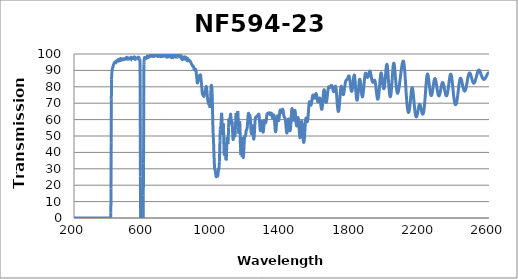
| Category | Transmission (%) |
|---|---|
| 2600.0 | 88.464 |
| 2599.0 | 88.485 |
| 2598.0 | 88.47 |
| 2597.0 | 88.44 |
| 2596.0 | 88.397 |
| 2595.0 | 88.304 |
| 2594.0 | 88.188 |
| 2593.0 | 88.125 |
| 2592.0 | 87.924 |
| 2591.0 | 87.725 |
| 2590.0 | 87.551 |
| 2589.0 | 87.424 |
| 2588.0 | 87.231 |
| 2587.0 | 87.037 |
| 2586.0 | 86.767 |
| 2585.0 | 86.582 |
| 2584.0 | 86.371 |
| 2583.0 | 86.162 |
| 2582.0 | 85.904 |
| 2581.0 | 85.711 |
| 2580.0 | 85.522 |
| 2579.0 | 85.347 |
| 2578.0 | 85.222 |
| 2577.0 | 85.022 |
| 2576.0 | 84.879 |
| 2575.0 | 84.786 |
| 2574.0 | 84.687 |
| 2573.0 | 84.596 |
| 2572.0 | 84.533 |
| 2571.0 | 84.469 |
| 2570.0 | 84.497 |
| 2569.0 | 84.521 |
| 2568.0 | 84.594 |
| 2567.0 | 84.698 |
| 2566.0 | 84.796 |
| 2565.0 | 84.958 |
| 2564.0 | 85.135 |
| 2563.0 | 85.333 |
| 2562.0 | 85.531 |
| 2561.0 | 85.71 |
| 2560.0 | 85.964 |
| 2559.0 | 86.209 |
| 2558.0 | 86.467 |
| 2557.0 | 86.714 |
| 2556.0 | 86.943 |
| 2555.0 | 87.203 |
| 2554.0 | 87.513 |
| 2553.0 | 87.805 |
| 2552.0 | 88.109 |
| 2551.0 | 88.415 |
| 2550.0 | 88.728 |
| 2549.0 | 89.023 |
| 2548.0 | 89.324 |
| 2547.0 | 89.566 |
| 2546.0 | 89.78 |
| 2545.0 | 89.955 |
| 2544.0 | 90.058 |
| 2543.0 | 90.173 |
| 2542.0 | 90.222 |
| 2541.0 | 90.188 |
| 2540.0 | 90.121 |
| 2539.0 | 90.014 |
| 2538.0 | 89.876 |
| 2537.0 | 89.689 |
| 2536.0 | 89.462 |
| 2535.0 | 89.143 |
| 2534.0 | 88.819 |
| 2533.0 | 88.51 |
| 2532.0 | 88.196 |
| 2531.0 | 87.824 |
| 2530.0 | 87.352 |
| 2529.0 | 86.969 |
| 2528.0 | 86.607 |
| 2527.0 | 86.205 |
| 2526.0 | 85.827 |
| 2525.0 | 85.366 |
| 2524.0 | 84.939 |
| 2523.0 | 84.605 |
| 2522.0 | 84.263 |
| 2521.0 | 83.888 |
| 2520.0 | 83.534 |
| 2519.0 | 83.224 |
| 2518.0 | 82.944 |
| 2517.0 | 82.735 |
| 2516.0 | 82.552 |
| 2515.0 | 82.402 |
| 2514.0 | 82.27 |
| 2513.0 | 82.218 |
| 2512.0 | 82.195 |
| 2511.0 | 82.241 |
| 2510.0 | 82.333 |
| 2509.0 | 82.436 |
| 2508.0 | 82.61 |
| 2507.0 | 82.794 |
| 2506.0 | 83.057 |
| 2505.0 | 83.388 |
| 2504.0 | 83.718 |
| 2503.0 | 84.05 |
| 2502.0 | 84.407 |
| 2501.0 | 84.802 |
| 2500.0 | 85.188 |
| 2499.0 | 85.576 |
| 2498.0 | 85.958 |
| 2497.0 | 86.379 |
| 2496.0 | 86.757 |
| 2495.0 | 87.116 |
| 2494.0 | 87.455 |
| 2493.0 | 87.752 |
| 2492.0 | 87.957 |
| 2491.0 | 88.143 |
| 2490.0 | 88.297 |
| 2489.0 | 88.428 |
| 2488.0 | 88.496 |
| 2487.0 | 88.471 |
| 2486.0 | 88.348 |
| 2485.0 | 88.205 |
| 2484.0 | 88.03 |
| 2483.0 | 87.769 |
| 2482.0 | 87.436 |
| 2481.0 | 87.046 |
| 2480.0 | 86.631 |
| 2479.0 | 86.167 |
| 2478.0 | 85.638 |
| 2477.0 | 85.081 |
| 2476.0 | 84.497 |
| 2475.0 | 83.854 |
| 2474.0 | 83.224 |
| 2473.0 | 82.598 |
| 2472.0 | 81.976 |
| 2471.0 | 81.372 |
| 2470.0 | 80.773 |
| 2469.0 | 80.189 |
| 2468.0 | 79.682 |
| 2467.0 | 79.242 |
| 2466.0 | 78.821 |
| 2465.0 | 78.436 |
| 2464.0 | 78.088 |
| 2463.0 | 77.814 |
| 2462.0 | 77.618 |
| 2461.0 | 77.469 |
| 2460.0 | 77.356 |
| 2459.0 | 77.342 |
| 2458.0 | 77.398 |
| 2457.0 | 77.495 |
| 2456.0 | 77.644 |
| 2455.0 | 77.859 |
| 2454.0 | 78.117 |
| 2453.0 | 78.423 |
| 2452.0 | 78.778 |
| 2451.0 | 79.208 |
| 2450.0 | 79.658 |
| 2449.0 | 80.148 |
| 2448.0 | 80.663 |
| 2447.0 | 81.181 |
| 2446.0 | 81.68 |
| 2445.0 | 82.205 |
| 2444.0 | 82.725 |
| 2443.0 | 83.223 |
| 2442.0 | 83.706 |
| 2441.0 | 84.118 |
| 2440.0 | 84.47 |
| 2439.0 | 84.77 |
| 2438.0 | 85.023 |
| 2437.0 | 85.181 |
| 2436.0 | 85.235 |
| 2435.0 | 85.198 |
| 2434.0 | 85.086 |
| 2433.0 | 84.897 |
| 2432.0 | 84.589 |
| 2431.0 | 84.168 |
| 2430.0 | 83.64 |
| 2429.0 | 83.044 |
| 2428.0 | 82.402 |
| 2427.0 | 81.683 |
| 2426.0 | 80.899 |
| 2425.0 | 80.036 |
| 2424.0 | 79.166 |
| 2423.0 | 78.289 |
| 2422.0 | 77.414 |
| 2421.0 | 76.537 |
| 2420.0 | 75.643 |
| 2419.0 | 74.762 |
| 2418.0 | 73.923 |
| 2417.0 | 73.13 |
| 2416.0 | 72.426 |
| 2415.0 | 71.773 |
| 2414.0 | 71.183 |
| 2413.0 | 70.653 |
| 2412.0 | 70.184 |
| 2411.0 | 69.8 |
| 2410.0 | 69.505 |
| 2409.0 | 69.296 |
| 2408.0 | 69.161 |
| 2407.0 | 69.105 |
| 2406.0 | 69.133 |
| 2405.0 | 69.242 |
| 2404.0 | 69.441 |
| 2403.0 | 69.718 |
| 2402.0 | 70.106 |
| 2401.0 | 70.578 |
| 2400.0 | 71.14 |
| 2399.0 | 71.807 |
| 2398.0 | 72.537 |
| 2397.0 | 73.348 |
| 2396.0 | 74.207 |
| 2395.0 | 75.11 |
| 2394.0 | 76.12 |
| 2393.0 | 77.199 |
| 2392.0 | 78.244 |
| 2391.0 | 79.277 |
| 2390.0 | 80.32 |
| 2389.0 | 81.364 |
| 2388.0 | 82.415 |
| 2387.0 | 83.409 |
| 2386.0 | 84.32 |
| 2385.0 | 85.158 |
| 2384.0 | 85.929 |
| 2383.0 | 86.563 |
| 2382.0 | 87.062 |
| 2381.0 | 87.432 |
| 2380.0 | 87.644 |
| 2379.0 | 87.724 |
| 2378.0 | 87.695 |
| 2377.0 | 87.541 |
| 2376.0 | 87.282 |
| 2375.0 | 86.941 |
| 2374.0 | 86.428 |
| 2373.0 | 85.798 |
| 2372.0 | 85.106 |
| 2371.0 | 84.396 |
| 2370.0 | 83.642 |
| 2369.0 | 82.818 |
| 2368.0 | 81.99 |
| 2367.0 | 81.183 |
| 2366.0 | 80.345 |
| 2365.0 | 79.538 |
| 2364.0 | 78.75 |
| 2363.0 | 77.999 |
| 2362.0 | 77.304 |
| 2361.0 | 76.697 |
| 2360.0 | 76.131 |
| 2359.0 | 75.658 |
| 2358.0 | 75.26 |
| 2357.0 | 74.905 |
| 2356.0 | 74.655 |
| 2355.0 | 74.513 |
| 2354.0 | 74.465 |
| 2353.0 | 74.511 |
| 2352.0 | 74.618 |
| 2351.0 | 74.775 |
| 2350.0 | 75.01 |
| 2349.0 | 75.335 |
| 2348.0 | 75.75 |
| 2347.0 | 76.223 |
| 2346.0 | 76.753 |
| 2345.0 | 77.278 |
| 2344.0 | 77.821 |
| 2343.0 | 78.415 |
| 2342.0 | 79.02 |
| 2341.0 | 79.59 |
| 2340.0 | 80.153 |
| 2339.0 | 80.659 |
| 2338.0 | 81.136 |
| 2337.0 | 81.596 |
| 2336.0 | 81.988 |
| 2335.0 | 82.268 |
| 2334.0 | 82.452 |
| 2333.0 | 82.567 |
| 2332.0 | 82.602 |
| 2331.0 | 82.574 |
| 2330.0 | 82.463 |
| 2329.0 | 82.256 |
| 2328.0 | 81.959 |
| 2327.0 | 81.592 |
| 2326.0 | 81.14 |
| 2325.0 | 80.664 |
| 2324.0 | 80.138 |
| 2323.0 | 79.569 |
| 2322.0 | 78.981 |
| 2321.0 | 78.415 |
| 2320.0 | 77.814 |
| 2319.0 | 77.255 |
| 2318.0 | 76.711 |
| 2317.0 | 76.196 |
| 2316.0 | 75.737 |
| 2315.0 | 75.332 |
| 2314.0 | 75.002 |
| 2313.0 | 74.767 |
| 2312.0 | 74.583 |
| 2311.0 | 74.462 |
| 2310.0 | 74.442 |
| 2309.0 | 74.516 |
| 2308.0 | 74.676 |
| 2307.0 | 74.904 |
| 2306.0 | 75.263 |
| 2305.0 | 75.66 |
| 2304.0 | 76.136 |
| 2303.0 | 76.691 |
| 2302.0 | 77.288 |
| 2301.0 | 77.929 |
| 2300.0 | 78.618 |
| 2299.0 | 79.316 |
| 2298.0 | 80.049 |
| 2297.0 | 80.817 |
| 2296.0 | 81.533 |
| 2295.0 | 82.192 |
| 2294.0 | 82.839 |
| 2293.0 | 83.408 |
| 2292.0 | 83.931 |
| 2291.0 | 84.346 |
| 2290.0 | 84.691 |
| 2289.0 | 84.943 |
| 2288.0 | 85.095 |
| 2287.0 | 85.112 |
| 2286.0 | 85.007 |
| 2285.0 | 84.797 |
| 2284.0 | 84.459 |
| 2283.0 | 84.022 |
| 2282.0 | 83.467 |
| 2281.0 | 82.881 |
| 2280.0 | 82.2 |
| 2279.0 | 81.52 |
| 2278.0 | 80.764 |
| 2277.0 | 79.99 |
| 2276.0 | 79.198 |
| 2275.0 | 78.457 |
| 2274.0 | 77.73 |
| 2273.0 | 77.066 |
| 2272.0 | 76.432 |
| 2271.0 | 75.886 |
| 2270.0 | 75.422 |
| 2269.0 | 75.066 |
| 2268.0 | 74.848 |
| 2267.0 | 74.685 |
| 2266.0 | 74.631 |
| 2265.0 | 74.695 |
| 2264.0 | 74.867 |
| 2263.0 | 75.139 |
| 2262.0 | 75.567 |
| 2261.0 | 76.061 |
| 2260.0 | 76.661 |
| 2259.0 | 77.307 |
| 2258.0 | 78.117 |
| 2257.0 | 78.997 |
| 2256.0 | 79.951 |
| 2255.0 | 80.839 |
| 2254.0 | 81.788 |
| 2253.0 | 82.69 |
| 2252.0 | 83.646 |
| 2251.0 | 84.548 |
| 2250.0 | 85.356 |
| 2249.0 | 86.131 |
| 2248.0 | 86.785 |
| 2247.0 | 87.272 |
| 2246.0 | 87.611 |
| 2245.0 | 87.855 |
| 2244.0 | 87.843 |
| 2243.0 | 87.635 |
| 2242.0 | 87.203 |
| 2241.0 | 86.62 |
| 2240.0 | 85.823 |
| 2239.0 | 84.898 |
| 2238.0 | 83.755 |
| 2237.0 | 82.565 |
| 2236.0 | 81.251 |
| 2235.0 | 79.835 |
| 2234.0 | 78.389 |
| 2233.0 | 76.888 |
| 2232.0 | 75.421 |
| 2231.0 | 73.97 |
| 2230.0 | 72.505 |
| 2229.0 | 71.239 |
| 2228.0 | 69.948 |
| 2227.0 | 68.829 |
| 2226.0 | 67.74 |
| 2225.0 | 66.785 |
| 2224.0 | 65.935 |
| 2223.0 | 65.203 |
| 2222.0 | 64.607 |
| 2221.0 | 64.141 |
| 2220.0 | 63.739 |
| 2219.0 | 63.515 |
| 2218.0 | 63.354 |
| 2217.0 | 63.296 |
| 2216.0 | 63.371 |
| 2215.0 | 63.528 |
| 2214.0 | 63.772 |
| 2213.0 | 64.023 |
| 2212.0 | 64.4 |
| 2211.0 | 64.785 |
| 2210.0 | 65.258 |
| 2209.0 | 65.748 |
| 2208.0 | 66.248 |
| 2207.0 | 66.811 |
| 2206.0 | 67.321 |
| 2205.0 | 67.815 |
| 2204.0 | 68.26 |
| 2203.0 | 68.665 |
| 2202.0 | 68.989 |
| 2201.0 | 69.21 |
| 2200.0 | 69.336 |
| 2199.0 | 69.386 |
| 2198.0 | 69.325 |
| 2197.0 | 69.178 |
| 2196.0 | 68.917 |
| 2195.0 | 68.614 |
| 2194.0 | 68.184 |
| 2193.0 | 67.659 |
| 2192.0 | 67.049 |
| 2191.0 | 66.509 |
| 2190.0 | 65.877 |
| 2189.0 | 65.238 |
| 2188.0 | 64.583 |
| 2187.0 | 64.007 |
| 2186.0 | 63.463 |
| 2185.0 | 62.947 |
| 2184.0 | 62.517 |
| 2183.0 | 62.168 |
| 2182.0 | 61.901 |
| 2181.0 | 61.738 |
| 2180.0 | 61.645 |
| 2179.0 | 61.677 |
| 2178.0 | 61.81 |
| 2177.0 | 62.071 |
| 2176.0 | 62.423 |
| 2175.0 | 62.846 |
| 2174.0 | 63.42 |
| 2173.0 | 64.119 |
| 2172.0 | 64.88 |
| 2171.0 | 65.696 |
| 2170.0 | 66.644 |
| 2169.0 | 67.671 |
| 2168.0 | 68.804 |
| 2167.0 | 70.004 |
| 2166.0 | 71.179 |
| 2165.0 | 72.308 |
| 2164.0 | 73.485 |
| 2163.0 | 74.647 |
| 2162.0 | 75.714 |
| 2161.0 | 76.719 |
| 2160.0 | 77.64 |
| 2159.0 | 78.305 |
| 2158.0 | 78.872 |
| 2157.0 | 79.228 |
| 2156.0 | 79.385 |
| 2155.0 | 79.361 |
| 2154.0 | 79.077 |
| 2153.0 | 78.631 |
| 2152.0 | 78.013 |
| 2151.0 | 77.246 |
| 2150.0 | 76.356 |
| 2149.0 | 75.32 |
| 2148.0 | 74.233 |
| 2147.0 | 73.086 |
| 2146.0 | 71.948 |
| 2145.0 | 70.867 |
| 2144.0 | 69.804 |
| 2143.0 | 68.783 |
| 2142.0 | 67.808 |
| 2141.0 | 67.013 |
| 2140.0 | 66.268 |
| 2139.0 | 65.641 |
| 2138.0 | 65.129 |
| 2137.0 | 64.749 |
| 2136.0 | 64.523 |
| 2135.0 | 64.38 |
| 2134.0 | 64.384 |
| 2133.0 | 64.554 |
| 2132.0 | 64.84 |
| 2131.0 | 65.25 |
| 2130.0 | 65.775 |
| 2129.0 | 66.478 |
| 2128.0 | 67.327 |
| 2127.0 | 68.239 |
| 2126.0 | 69.282 |
| 2125.0 | 70.409 |
| 2124.0 | 71.738 |
| 2123.0 | 73.183 |
| 2122.0 | 74.623 |
| 2121.0 | 76.18 |
| 2120.0 | 77.819 |
| 2119.0 | 79.474 |
| 2118.0 | 81.251 |
| 2117.0 | 82.905 |
| 2116.0 | 84.609 |
| 2115.0 | 86.247 |
| 2114.0 | 87.874 |
| 2113.0 | 89.244 |
| 2112.0 | 90.592 |
| 2111.0 | 91.783 |
| 2110.0 | 92.844 |
| 2109.0 | 93.737 |
| 2108.0 | 94.411 |
| 2107.0 | 94.983 |
| 2106.0 | 95.381 |
| 2105.0 | 95.605 |
| 2104.0 | 95.7 |
| 2103.0 | 95.644 |
| 2102.0 | 95.492 |
| 2101.0 | 95.206 |
| 2100.0 | 94.817 |
| 2099.0 | 94.37 |
| 2098.0 | 93.846 |
| 2097.0 | 93.265 |
| 2096.0 | 92.619 |
| 2095.0 | 91.926 |
| 2094.0 | 91.225 |
| 2093.0 | 90.468 |
| 2092.0 | 89.673 |
| 2091.0 | 88.861 |
| 2090.0 | 88.054 |
| 2089.0 | 87.216 |
| 2088.0 | 86.375 |
| 2087.0 | 85.517 |
| 2086.0 | 84.636 |
| 2085.0 | 83.78 |
| 2084.0 | 82.907 |
| 2083.0 | 82.082 |
| 2082.0 | 81.261 |
| 2081.0 | 80.45 |
| 2080.0 | 79.706 |
| 2079.0 | 78.994 |
| 2078.0 | 78.318 |
| 2077.0 | 77.699 |
| 2076.0 | 77.204 |
| 2075.0 | 76.799 |
| 2074.0 | 76.445 |
| 2073.0 | 76.201 |
| 2072.0 | 76.084 |
| 2071.0 | 76.085 |
| 2070.0 | 76.215 |
| 2069.0 | 76.476 |
| 2068.0 | 76.865 |
| 2067.0 | 77.365 |
| 2066.0 | 78.033 |
| 2065.0 | 78.847 |
| 2064.0 | 79.752 |
| 2063.0 | 80.756 |
| 2062.0 | 81.867 |
| 2061.0 | 83.118 |
| 2060.0 | 84.416 |
| 2059.0 | 85.699 |
| 2058.0 | 87.049 |
| 2057.0 | 88.369 |
| 2056.0 | 89.689 |
| 2055.0 | 90.911 |
| 2054.0 | 91.948 |
| 2053.0 | 92.852 |
| 2052.0 | 93.583 |
| 2051.0 | 94.126 |
| 2050.0 | 94.386 |
| 2049.0 | 94.36 |
| 2048.0 | 94.103 |
| 2047.0 | 93.566 |
| 2046.0 | 92.811 |
| 2045.0 | 91.834 |
| 2044.0 | 90.628 |
| 2043.0 | 89.25 |
| 2042.0 | 87.772 |
| 2041.0 | 86.182 |
| 2040.0 | 84.55 |
| 2039.0 | 82.965 |
| 2038.0 | 81.401 |
| 2037.0 | 79.927 |
| 2036.0 | 78.594 |
| 2035.0 | 77.401 |
| 2034.0 | 76.343 |
| 2033.0 | 75.453 |
| 2032.0 | 74.759 |
| 2031.0 | 74.283 |
| 2030.0 | 73.996 |
| 2029.0 | 73.897 |
| 2028.0 | 74.03 |
| 2027.0 | 74.379 |
| 2026.0 | 74.891 |
| 2025.0 | 75.621 |
| 2024.0 | 76.579 |
| 2023.0 | 77.679 |
| 2022.0 | 78.912 |
| 2021.0 | 80.294 |
| 2020.0 | 81.749 |
| 2019.0 | 83.28 |
| 2018.0 | 84.919 |
| 2017.0 | 86.519 |
| 2016.0 | 88 |
| 2015.0 | 89.428 |
| 2014.0 | 90.745 |
| 2013.0 | 91.863 |
| 2012.0 | 92.717 |
| 2011.0 | 93.302 |
| 2010.0 | 93.619 |
| 2009.0 | 93.683 |
| 2008.0 | 93.443 |
| 2007.0 | 92.93 |
| 2006.0 | 92.179 |
| 2005.0 | 91.227 |
| 2004.0 | 90.109 |
| 2003.0 | 88.853 |
| 2002.0 | 87.551 |
| 2001.0 | 86.195 |
| 2000.0 | 84.854 |
| 1999.0 | 83.598 |
| 1998.0 | 82.419 |
| 1997.0 | 81.396 |
| 1996.0 | 80.523 |
| 1995.0 | 79.816 |
| 1994.0 | 79.292 |
| 1993.0 | 78.95 |
| 1992.0 | 78.808 |
| 1991.0 | 78.866 |
| 1990.0 | 79.093 |
| 1989.0 | 79.497 |
| 1988.0 | 80.064 |
| 1987.0 | 80.785 |
| 1986.0 | 81.596 |
| 1985.0 | 82.513 |
| 1984.0 | 83.482 |
| 1983.0 | 84.467 |
| 1982.0 | 85.423 |
| 1981.0 | 86.315 |
| 1980.0 | 87.087 |
| 1979.0 | 87.729 |
| 1978.0 | 88.201 |
| 1977.0 | 88.466 |
| 1976.0 | 88.496 |
| 1975.0 | 88.292 |
| 1974.0 | 87.862 |
| 1973.0 | 87.221 |
| 1972.0 | 86.366 |
| 1971.0 | 85.363 |
| 1970.0 | 84.23 |
| 1969.0 | 83.006 |
| 1968.0 | 81.76 |
| 1967.0 | 80.399 |
| 1966.0 | 79.092 |
| 1965.0 | 77.887 |
| 1964.0 | 76.716 |
| 1963.0 | 75.655 |
| 1962.0 | 74.726 |
| 1961.0 | 73.907 |
| 1960.0 | 73.295 |
| 1959.0 | 72.832 |
| 1958.0 | 72.533 |
| 1957.0 | 72.431 |
| 1956.0 | 72.484 |
| 1955.0 | 72.692 |
| 1954.0 | 73.055 |
| 1953.0 | 73.58 |
| 1952.0 | 74.235 |
| 1951.0 | 75.049 |
| 1950.0 | 75.888 |
| 1949.0 | 76.838 |
| 1948.0 | 77.792 |
| 1947.0 | 78.752 |
| 1946.0 | 79.666 |
| 1945.0 | 80.599 |
| 1944.0 | 81.446 |
| 1943.0 | 82.152 |
| 1942.0 | 82.78 |
| 1941.0 | 83.287 |
| 1940.0 | 83.657 |
| 1939.0 | 83.891 |
| 1938.0 | 84.023 |
| 1937.0 | 83.986 |
| 1936.0 | 83.911 |
| 1935.0 | 83.769 |
| 1934.0 | 83.606 |
| 1933.0 | 83.403 |
| 1932.0 | 83.188 |
| 1931.0 | 83.005 |
| 1930.0 | 82.847 |
| 1929.0 | 82.741 |
| 1928.0 | 82.733 |
| 1927.0 | 82.783 |
| 1926.0 | 82.944 |
| 1925.0 | 83.234 |
| 1924.0 | 83.56 |
| 1923.0 | 83.988 |
| 1922.0 | 84.513 |
| 1921.0 | 85.089 |
| 1920.0 | 85.737 |
| 1919.0 | 86.398 |
| 1918.0 | 87.074 |
| 1917.0 | 87.66 |
| 1916.0 | 88.177 |
| 1915.0 | 88.597 |
| 1914.0 | 89.036 |
| 1913.0 | 89.379 |
| 1912.0 | 89.555 |
| 1911.0 | 89.594 |
| 1910.0 | 89.545 |
| 1909.0 | 89.432 |
| 1908.0 | 89.138 |
| 1907.0 | 88.795 |
| 1906.0 | 88.299 |
| 1905.0 | 87.787 |
| 1904.0 | 87.352 |
| 1903.0 | 86.936 |
| 1902.0 | 86.588 |
| 1901.0 | 86.219 |
| 1900.0 | 85.977 |
| 1899.0 | 85.78 |
| 1898.0 | 85.671 |
| 1897.0 | 85.703 |
| 1896.0 | 85.874 |
| 1895.0 | 86.005 |
| 1894.0 | 86.246 |
| 1893.0 | 86.597 |
| 1892.0 | 86.946 |
| 1891.0 | 87.291 |
| 1890.0 | 87.647 |
| 1889.0 | 87.909 |
| 1888.0 | 88.168 |
| 1887.0 | 88.286 |
| 1886.0 | 88.285 |
| 1885.0 | 88.056 |
| 1884.0 | 87.655 |
| 1883.0 | 87.147 |
| 1882.0 | 86.433 |
| 1881.0 | 85.498 |
| 1880.0 | 84.605 |
| 1879.0 | 83.518 |
| 1878.0 | 82.42 |
| 1877.0 | 81.162 |
| 1876.0 | 79.956 |
| 1875.0 | 78.699 |
| 1874.0 | 77.61 |
| 1873.0 | 76.505 |
| 1872.0 | 75.676 |
| 1871.0 | 74.836 |
| 1870.0 | 74.302 |
| 1869.0 | 73.931 |
| 1868.0 | 73.822 |
| 1867.0 | 73.947 |
| 1866.0 | 74.262 |
| 1865.0 | 74.757 |
| 1864.0 | 75.374 |
| 1863.0 | 76.145 |
| 1862.0 | 77.024 |
| 1861.0 | 78.15 |
| 1860.0 | 79.163 |
| 1859.0 | 80.288 |
| 1858.0 | 81.398 |
| 1857.0 | 82.308 |
| 1856.0 | 83.158 |
| 1855.0 | 83.867 |
| 1854.0 | 84.311 |
| 1853.0 | 84.538 |
| 1852.0 | 84.54 |
| 1851.0 | 84.306 |
| 1850.0 | 83.871 |
| 1849.0 | 83.1 |
| 1848.0 | 81.925 |
| 1847.0 | 80.542 |
| 1846.0 | 79.159 |
| 1845.0 | 78.007 |
| 1844.0 | 77.037 |
| 1843.0 | 76.078 |
| 1842.0 | 75 |
| 1841.0 | 73.93 |
| 1840.0 | 72.918 |
| 1839.0 | 72.241 |
| 1838.0 | 71.923 |
| 1837.0 | 71.799 |
| 1836.0 | 71.942 |
| 1835.0 | 72.275 |
| 1834.0 | 72.815 |
| 1833.0 | 73.615 |
| 1832.0 | 74.602 |
| 1831.0 | 75.711 |
| 1830.0 | 77.135 |
| 1829.0 | 78.534 |
| 1828.0 | 80.013 |
| 1827.0 | 81.504 |
| 1826.0 | 83.015 |
| 1825.0 | 84.39 |
| 1824.0 | 85.407 |
| 1823.0 | 86.26 |
| 1822.0 | 86.771 |
| 1821.0 | 87.116 |
| 1820.0 | 87.078 |
| 1819.0 | 86.768 |
| 1818.0 | 86.217 |
| 1817.0 | 85.603 |
| 1816.0 | 84.776 |
| 1815.0 | 83.703 |
| 1814.0 | 82.666 |
| 1813.0 | 81.608 |
| 1812.0 | 80.609 |
| 1811.0 | 79.594 |
| 1810.0 | 78.755 |
| 1809.0 | 78.02 |
| 1808.0 | 77.535 |
| 1807.0 | 77.249 |
| 1806.0 | 77.165 |
| 1805.0 | 77.198 |
| 1804.0 | 77.407 |
| 1803.0 | 77.812 |
| 1802.0 | 78.375 |
| 1801.0 | 79.112 |
| 1800.0 | 79.948 |
| 1799.0 | 80.83 |
| 1798.0 | 81.749 |
| 1797.0 | 82.731 |
| 1796.0 | 83.659 |
| 1795.0 | 84.51 |
| 1794.0 | 85.17 |
| 1793.0 | 85.751 |
| 1792.0 | 86.181 |
| 1791.0 | 86.49 |
| 1790.0 | 86.65 |
| 1789.0 | 86.672 |
| 1788.0 | 86.521 |
| 1787.0 | 86.32 |
| 1786.0 | 86.088 |
| 1785.0 | 85.777 |
| 1784.0 | 85.488 |
| 1783.0 | 85.193 |
| 1782.0 | 84.907 |
| 1781.0 | 84.719 |
| 1780.0 | 84.579 |
| 1779.0 | 84.464 |
| 1778.0 | 84.371 |
| 1777.0 | 84.328 |
| 1776.0 | 84.257 |
| 1775.0 | 84.18 |
| 1774.0 | 84.057 |
| 1773.0 | 83.879 |
| 1772.0 | 83.62 |
| 1771.0 | 83.275 |
| 1770.0 | 82.823 |
| 1769.0 | 82.269 |
| 1768.0 | 81.69 |
| 1767.0 | 80.977 |
| 1766.0 | 80.227 |
| 1765.0 | 79.402 |
| 1764.0 | 78.603 |
| 1763.0 | 77.821 |
| 1762.0 | 77.099 |
| 1761.0 | 76.465 |
| 1760.0 | 75.903 |
| 1759.0 | 75.48 |
| 1758.0 | 75.249 |
| 1757.0 | 75.186 |
| 1756.0 | 75.291 |
| 1755.0 | 75.538 |
| 1754.0 | 75.919 |
| 1753.0 | 76.459 |
| 1752.0 | 77.076 |
| 1751.0 | 77.791 |
| 1750.0 | 78.517 |
| 1749.0 | 79.181 |
| 1748.0 | 79.736 |
| 1747.0 | 80.156 |
| 1746.0 | 80.352 |
| 1745.0 | 80.343 |
| 1744.0 | 80.047 |
| 1743.0 | 79.455 |
| 1742.0 | 78.589 |
| 1741.0 | 77.494 |
| 1740.0 | 76.301 |
| 1739.0 | 74.888 |
| 1738.0 | 73.441 |
| 1737.0 | 71.994 |
| 1736.0 | 70.545 |
| 1735.0 | 69.181 |
| 1734.0 | 68.003 |
| 1733.0 | 66.941 |
| 1732.0 | 66.11 |
| 1731.0 | 65.473 |
| 1730.0 | 65.066 |
| 1729.0 | 64.905 |
| 1728.0 | 65.013 |
| 1727.0 | 65.323 |
| 1726.0 | 65.884 |
| 1725.0 | 66.676 |
| 1724.0 | 67.655 |
| 1723.0 | 68.847 |
| 1722.0 | 70.201 |
| 1721.0 | 71.679 |
| 1720.0 | 73.161 |
| 1719.0 | 74.659 |
| 1718.0 | 76.065 |
| 1717.0 | 77.338 |
| 1716.0 | 78.466 |
| 1715.0 | 79.338 |
| 1714.0 | 79.918 |
| 1713.0 | 80.27 |
| 1712.0 | 80.39 |
| 1711.0 | 80.276 |
| 1710.0 | 79.974 |
| 1709.0 | 79.529 |
| 1708.0 | 79.004 |
| 1707.0 | 78.449 |
| 1706.0 | 77.969 |
| 1705.0 | 77.559 |
| 1704.0 | 77.239 |
| 1703.0 | 77.053 |
| 1702.0 | 76.982 |
| 1701.0 | 77.054 |
| 1700.0 | 77.275 |
| 1699.0 | 77.595 |
| 1698.0 | 77.998 |
| 1697.0 | 78.441 |
| 1696.0 | 78.915 |
| 1695.0 | 79.399 |
| 1694.0 | 79.857 |
| 1693.0 | 80.268 |
| 1692.0 | 80.583 |
| 1691.0 | 80.778 |
| 1690.0 | 80.875 |
| 1689.0 | 80.879 |
| 1688.0 | 80.828 |
| 1687.0 | 80.703 |
| 1686.0 | 80.492 |
| 1685.0 | 80.247 |
| 1684.0 | 79.995 |
| 1683.0 | 79.796 |
| 1682.0 | 79.661 |
| 1681.0 | 79.607 |
| 1680.0 | 79.586 |
| 1679.0 | 79.626 |
| 1678.0 | 79.735 |
| 1677.0 | 79.867 |
| 1676.0 | 79.992 |
| 1675.0 | 80.076 |
| 1674.0 | 80.082 |
| 1673.0 | 79.978 |
| 1672.0 | 79.755 |
| 1671.0 | 79.374 |
| 1670.0 | 78.829 |
| 1669.0 | 78.12 |
| 1668.0 | 77.299 |
| 1667.0 | 76.396 |
| 1666.0 | 75.412 |
| 1665.0 | 74.388 |
| 1664.0 | 73.401 |
| 1663.0 | 72.507 |
| 1662.0 | 71.765 |
| 1661.0 | 71.199 |
| 1660.0 | 70.775 |
| 1659.0 | 70.529 |
| 1658.0 | 70.518 |
| 1657.0 | 70.733 |
| 1656.0 | 71.189 |
| 1655.0 | 71.841 |
| 1654.0 | 72.617 |
| 1653.0 | 73.51 |
| 1652.0 | 74.502 |
| 1651.0 | 75.531 |
| 1650.0 | 76.466 |
| 1649.0 | 77.266 |
| 1648.0 | 77.852 |
| 1647.0 | 78.182 |
| 1646.0 | 78.222 |
| 1645.0 | 77.941 |
| 1644.0 | 77.347 |
| 1643.0 | 76.447 |
| 1642.0 | 75.32 |
| 1641.0 | 74.051 |
| 1640.0 | 72.662 |
| 1639.0 | 71.254 |
| 1638.0 | 69.95 |
| 1637.0 | 68.765 |
| 1636.0 | 67.77 |
| 1635.0 | 67.019 |
| 1634.0 | 66.507 |
| 1633.0 | 66.261 |
| 1632.0 | 66.261 |
| 1631.0 | 66.507 |
| 1630.0 | 66.985 |
| 1629.0 | 67.656 |
| 1628.0 | 68.482 |
| 1627.0 | 69.371 |
| 1626.0 | 70.269 |
| 1625.0 | 71.102 |
| 1624.0 | 71.846 |
| 1623.0 | 72.454 |
| 1622.0 | 72.9 |
| 1621.0 | 73.146 |
| 1620.0 | 73.185 |
| 1619.0 | 73.03 |
| 1618.0 | 72.731 |
| 1617.0 | 72.354 |
| 1616.0 | 71.938 |
| 1615.0 | 71.53 |
| 1614.0 | 71.137 |
| 1613.0 | 70.849 |
| 1612.0 | 70.696 |
| 1611.0 | 70.694 |
| 1610.0 | 70.862 |
| 1609.0 | 71.161 |
| 1608.0 | 71.581 |
| 1607.0 | 72.141 |
| 1606.0 | 72.811 |
| 1605.0 | 73.534 |
| 1604.0 | 74.231 |
| 1603.0 | 74.86 |
| 1602.0 | 75.376 |
| 1601.0 | 75.731 |
| 1600.0 | 75.9 |
| 1599.0 | 75.91 |
| 1598.0 | 75.746 |
| 1597.0 | 75.412 |
| 1596.0 | 74.96 |
| 1595.0 | 74.467 |
| 1594.0 | 73.964 |
| 1593.0 | 73.538 |
| 1592.0 | 73.223 |
| 1591.0 | 73.03 |
| 1590.0 | 72.991 |
| 1589.0 | 73.089 |
| 1588.0 | 73.319 |
| 1587.0 | 73.649 |
| 1586.0 | 74 |
| 1585.0 | 74.363 |
| 1584.0 | 74.673 |
| 1583.0 | 74.888 |
| 1582.0 | 74.967 |
| 1581.0 | 74.855 |
| 1580.0 | 74.535 |
| 1579.0 | 74.078 |
| 1578.0 | 73.443 |
| 1577.0 | 72.709 |
| 1576.0 | 71.902 |
| 1575.0 | 71.099 |
| 1574.0 | 70.341 |
| 1573.0 | 69.722 |
| 1572.0 | 69.235 |
| 1571.0 | 68.899 |
| 1570.0 | 68.767 |
| 1569.0 | 68.826 |
| 1568.0 | 69.062 |
| 1567.0 | 69.402 |
| 1566.0 | 69.82 |
| 1565.0 | 70.275 |
| 1564.0 | 70.665 |
| 1563.0 | 70.896 |
| 1562.0 | 70.893 |
| 1561.0 | 70.64 |
| 1560.0 | 70.082 |
| 1559.0 | 69.185 |
| 1558.0 | 67.999 |
| 1557.0 | 66.62 |
| 1556.0 | 65.052 |
| 1555.0 | 63.638 |
| 1554.0 | 62.243 |
| 1553.0 | 61.05 |
| 1552.0 | 60.025 |
| 1551.0 | 59.273 |
| 1550.0 | 58.799 |
| 1549.0 | 58.644 |
| 1548.0 | 58.747 |
| 1547.0 | 59.047 |
| 1546.0 | 59.526 |
| 1545.0 | 60.057 |
| 1544.0 | 60.539 |
| 1543.0 | 60.893 |
| 1542.0 | 60.989 |
| 1541.0 | 60.747 |
| 1540.0 | 60.111 |
| 1539.0 | 59.072 |
| 1538.0 | 57.777 |
| 1537.0 | 56.211 |
| 1536.0 | 54.461 |
| 1535.0 | 52.714 |
| 1534.0 | 51.015 |
| 1533.0 | 49.452 |
| 1532.0 | 48.128 |
| 1531.0 | 47.104 |
| 1530.0 | 46.415 |
| 1529.0 | 46.099 |
| 1528.0 | 46.132 |
| 1527.0 | 46.524 |
| 1526.0 | 47.294 |
| 1525.0 | 48.448 |
| 1524.0 | 49.885 |
| 1523.0 | 51.523 |
| 1522.0 | 53.382 |
| 1521.0 | 55.142 |
| 1520.0 | 56.843 |
| 1519.0 | 58.085 |
| 1518.0 | 58.816 |
| 1517.0 | 58.941 |
| 1516.0 | 58.466 |
| 1515.0 | 57.476 |
| 1514.0 | 56.141 |
| 1513.0 | 54.604 |
| 1512.0 | 52.998 |
| 1511.0 | 51.517 |
| 1510.0 | 50.261 |
| 1509.0 | 49.456 |
| 1508.0 | 48.981 |
| 1507.0 | 48.914 |
| 1506.0 | 49.269 |
| 1505.0 | 49.978 |
| 1504.0 | 51.122 |
| 1503.0 | 52.62 |
| 1502.0 | 54.257 |
| 1501.0 | 55.975 |
| 1500.0 | 57.671 |
| 1499.0 | 59.133 |
| 1498.0 | 60.282 |
| 1497.0 | 61.008 |
| 1496.0 | 61.278 |
| 1495.0 | 61.086 |
| 1494.0 | 60.474 |
| 1493.0 | 59.612 |
| 1492.0 | 58.695 |
| 1491.0 | 57.752 |
| 1490.0 | 56.953 |
| 1489.0 | 56.404 |
| 1488.0 | 56.148 |
| 1487.0 | 56.247 |
| 1486.0 | 56.701 |
| 1485.0 | 57.531 |
| 1484.0 | 58.669 |
| 1483.0 | 60.01 |
| 1482.0 | 61.485 |
| 1481.0 | 62.906 |
| 1480.0 | 64.181 |
| 1479.0 | 65.115 |
| 1478.0 | 65.553 |
| 1477.0 | 65.493 |
| 1476.0 | 64.944 |
| 1475.0 | 64.086 |
| 1474.0 | 62.971 |
| 1473.0 | 61.913 |
| 1472.0 | 60.913 |
| 1471.0 | 60.161 |
| 1470.0 | 59.715 |
| 1469.0 | 59.666 |
| 1468.0 | 60.018 |
| 1467.0 | 60.749 |
| 1466.0 | 61.831 |
| 1465.0 | 63.124 |
| 1464.0 | 64.371 |
| 1463.0 | 65.523 |
| 1462.0 | 66.413 |
| 1461.0 | 66.747 |
| 1460.0 | 66.536 |
| 1459.0 | 65.705 |
| 1458.0 | 64.329 |
| 1457.0 | 62.747 |
| 1456.0 | 60.783 |
| 1455.0 | 58.888 |
| 1454.0 | 57.002 |
| 1453.0 | 55.423 |
| 1452.0 | 54.345 |
| 1451.0 | 53.567 |
| 1450.0 | 53.202 |
| 1449.0 | 53.223 |
| 1448.0 | 53.663 |
| 1447.0 | 54.442 |
| 1446.0 | 55.604 |
| 1445.0 | 56.9 |
| 1444.0 | 58.14 |
| 1443.0 | 59.218 |
| 1442.0 | 60.092 |
| 1441.0 | 60.422 |
| 1440.0 | 60.262 |
| 1439.0 | 59.633 |
| 1438.0 | 58.544 |
| 1437.0 | 57.212 |
| 1436.0 | 55.77 |
| 1435.0 | 54.449 |
| 1434.0 | 53.219 |
| 1433.0 | 52.45 |
| 1432.0 | 51.931 |
| 1431.0 | 51.768 |
| 1430.0 | 51.954 |
| 1429.0 | 52.504 |
| 1428.0 | 53.438 |
| 1427.0 | 54.52 |
| 1426.0 | 55.754 |
| 1425.0 | 56.959 |
| 1424.0 | 58.169 |
| 1423.0 | 59.212 |
| 1422.0 | 60.014 |
| 1421.0 | 60.564 |
| 1420.0 | 60.944 |
| 1419.0 | 61.128 |
| 1418.0 | 61.239 |
| 1417.0 | 61.302 |
| 1416.0 | 61.431 |
| 1415.0 | 61.742 |
| 1414.0 | 62.193 |
| 1413.0 | 62.713 |
| 1412.0 | 63.304 |
| 1411.0 | 64.054 |
| 1410.0 | 64.869 |
| 1409.0 | 65.534 |
| 1408.0 | 65.989 |
| 1407.0 | 66.28 |
| 1406.0 | 66.367 |
| 1405.0 | 66.273 |
| 1404.0 | 65.954 |
| 1403.0 | 65.527 |
| 1402.0 | 65.171 |
| 1401.0 | 64.881 |
| 1400.0 | 64.617 |
| 1399.0 | 64.375 |
| 1398.0 | 64.496 |
| 1397.0 | 64.757 |
| 1396.0 | 65.259 |
| 1395.0 | 65.613 |
| 1394.0 | 65.807 |
| 1393.0 | 65.9 |
| 1392.0 | 65.784 |
| 1391.0 | 65.327 |
| 1390.0 | 64.675 |
| 1389.0 | 63.797 |
| 1388.0 | 62.728 |
| 1387.0 | 61.569 |
| 1386.0 | 60.56 |
| 1385.0 | 59.811 |
| 1384.0 | 59.419 |
| 1383.0 | 59.305 |
| 1382.0 | 59.388 |
| 1381.0 | 59.743 |
| 1380.0 | 60.299 |
| 1379.0 | 60.913 |
| 1378.0 | 61.629 |
| 1377.0 | 62.13 |
| 1376.0 | 62.272 |
| 1375.0 | 61.923 |
| 1374.0 | 61.134 |
| 1373.0 | 60.053 |
| 1372.0 | 58.738 |
| 1371.0 | 57.217 |
| 1370.0 | 55.707 |
| 1369.0 | 54.415 |
| 1368.0 | 53.412 |
| 1367.0 | 52.771 |
| 1366.0 | 52.523 |
| 1365.0 | 52.774 |
| 1364.0 | 53.435 |
| 1363.0 | 54.358 |
| 1362.0 | 55.699 |
| 1361.0 | 57.282 |
| 1360.0 | 58.85 |
| 1359.0 | 60.182 |
| 1358.0 | 61.481 |
| 1357.0 | 62.282 |
| 1356.0 | 62.791 |
| 1355.0 | 62.793 |
| 1354.0 | 62.445 |
| 1353.0 | 61.923 |
| 1352.0 | 61.337 |
| 1351.0 | 60.938 |
| 1350.0 | 60.752 |
| 1349.0 | 60.756 |
| 1348.0 | 60.984 |
| 1347.0 | 61.339 |
| 1346.0 | 61.867 |
| 1345.0 | 62.491 |
| 1344.0 | 63.125 |
| 1343.0 | 63.559 |
| 1342.0 | 63.852 |
| 1341.0 | 63.974 |
| 1340.0 | 63.964 |
| 1339.0 | 63.805 |
| 1338.0 | 63.584 |
| 1337.0 | 63.346 |
| 1336.0 | 63.168 |
| 1335.0 | 63.085 |
| 1334.0 | 63.113 |
| 1333.0 | 63.251 |
| 1332.0 | 63.462 |
| 1331.0 | 63.684 |
| 1330.0 | 63.905 |
| 1329.0 | 64.09 |
| 1328.0 | 64.198 |
| 1327.0 | 64.199 |
| 1326.0 | 64.129 |
| 1325.0 | 63.991 |
| 1324.0 | 63.854 |
| 1323.0 | 63.783 |
| 1322.0 | 63.732 |
| 1321.0 | 63.687 |
| 1320.0 | 63.688 |
| 1319.0 | 63.697 |
| 1318.0 | 63.643 |
| 1317.0 | 63.442 |
| 1316.0 | 63.058 |
| 1315.0 | 62.484 |
| 1314.0 | 61.695 |
| 1313.0 | 60.832 |
| 1312.0 | 59.944 |
| 1311.0 | 59.148 |
| 1310.0 | 58.571 |
| 1309.0 | 58.171 |
| 1308.0 | 58.026 |
| 1307.0 | 58.141 |
| 1306.0 | 58.473 |
| 1305.0 | 58.902 |
| 1304.0 | 59.276 |
| 1303.0 | 59.492 |
| 1302.0 | 59.463 |
| 1301.0 | 59.06 |
| 1300.0 | 58.251 |
| 1299.0 | 57.17 |
| 1298.0 | 55.95 |
| 1297.0 | 54.705 |
| 1296.0 | 53.597 |
| 1295.0 | 52.82 |
| 1294.0 | 52.378 |
| 1293.0 | 52.344 |
| 1292.0 | 52.733 |
| 1291.0 | 53.524 |
| 1290.0 | 54.626 |
| 1289.0 | 55.886 |
| 1288.0 | 57.159 |
| 1287.0 | 58.194 |
| 1286.0 | 58.794 |
| 1285.0 | 58.849 |
| 1284.0 | 58.368 |
| 1283.0 | 57.464 |
| 1282.0 | 56.27 |
| 1281.0 | 55.062 |
| 1280.0 | 54.065 |
| 1279.0 | 53.408 |
| 1278.0 | 53.24 |
| 1277.0 | 53.586 |
| 1276.0 | 54.389 |
| 1275.0 | 55.634 |
| 1274.0 | 57.179 |
| 1273.0 | 58.806 |
| 1272.0 | 60.413 |
| 1271.0 | 61.773 |
| 1270.0 | 62.74 |
| 1269.0 | 63.241 |
| 1268.0 | 63.362 |
| 1267.0 | 63.215 |
| 1266.0 | 62.937 |
| 1265.0 | 62.632 |
| 1264.0 | 62.388 |
| 1263.0 | 62.247 |
| 1262.0 | 62.212 |
| 1261.0 | 62.243 |
| 1260.0 | 62.27 |
| 1259.0 | 62.242 |
| 1258.0 | 62.154 |
| 1257.0 | 62.007 |
| 1256.0 | 61.824 |
| 1255.0 | 61.667 |
| 1254.0 | 61.558 |
| 1253.0 | 61.522 |
| 1252.0 | 61.515 |
| 1251.0 | 61.497 |
| 1250.0 | 61.349 |
| 1249.0 | 60.922 |
| 1248.0 | 60.102 |
| 1247.0 | 58.821 |
| 1246.0 | 57.161 |
| 1245.0 | 55.21 |
| 1244.0 | 53.182 |
| 1243.0 | 51.283 |
| 1242.0 | 49.717 |
| 1241.0 | 48.608 |
| 1240.0 | 48.099 |
| 1239.0 | 48.269 |
| 1238.0 | 49.055 |
| 1237.0 | 50.384 |
| 1236.0 | 52.021 |
| 1235.0 | 53.776 |
| 1234.0 | 55.215 |
| 1233.0 | 56.076 |
| 1232.0 | 56.283 |
| 1231.0 | 55.775 |
| 1230.0 | 54.746 |
| 1229.0 | 53.476 |
| 1228.0 | 52.318 |
| 1227.0 | 51.542 |
| 1226.0 | 51.349 |
| 1225.0 | 51.757 |
| 1224.0 | 52.738 |
| 1223.0 | 54.268 |
| 1222.0 | 56.126 |
| 1221.0 | 58.075 |
| 1220.0 | 59.891 |
| 1219.0 | 61.333 |
| 1218.0 | 62.214 |
| 1217.0 | 62.612 |
| 1216.0 | 62.668 |
| 1215.0 | 62.559 |
| 1214.0 | 62.49 |
| 1213.0 | 62.588 |
| 1212.0 | 62.876 |
| 1211.0 | 63.313 |
| 1210.0 | 63.716 |
| 1209.0 | 63.882 |
| 1208.0 | 63.627 |
| 1207.0 | 62.864 |
| 1206.0 | 61.601 |
| 1205.0 | 60.012 |
| 1204.0 | 58.31 |
| 1203.0 | 56.773 |
| 1202.0 | 55.569 |
| 1201.0 | 54.668 |
| 1200.0 | 54.145 |
| 1199.0 | 53.907 |
| 1198.0 | 53.799 |
| 1197.0 | 53.626 |
| 1196.0 | 53.246 |
| 1195.0 | 52.612 |
| 1194.0 | 51.797 |
| 1193.0 | 51.016 |
| 1192.0 | 50.404 |
| 1191.0 | 50.025 |
| 1190.0 | 49.93 |
| 1189.0 | 49.991 |
| 1188.0 | 50.033 |
| 1187.0 | 49.759 |
| 1186.0 | 48.918 |
| 1185.0 | 47.407 |
| 1184.0 | 45.338 |
| 1183.0 | 42.932 |
| 1182.0 | 40.628 |
| 1181.0 | 38.716 |
| 1180.0 | 37.393 |
| 1179.0 | 36.881 |
| 1178.0 | 37.238 |
| 1177.0 | 38.538 |
| 1176.0 | 40.627 |
| 1175.0 | 43.28 |
| 1174.0 | 46.067 |
| 1173.0 | 48.357 |
| 1172.0 | 49.388 |
| 1171.0 | 48.792 |
| 1170.0 | 46.857 |
| 1169.0 | 44.122 |
| 1168.0 | 41.434 |
| 1167.0 | 39.378 |
| 1166.0 | 38.29 |
| 1165.0 | 38.362 |
| 1164.0 | 39.729 |
| 1163.0 | 42.444 |
| 1162.0 | 46.22 |
| 1161.0 | 50.914 |
| 1160.0 | 55.315 |
| 1159.0 | 58.274 |
| 1158.0 | 59.12 |
| 1157.0 | 57.935 |
| 1156.0 | 55.66 |
| 1155.0 | 53.187 |
| 1154.0 | 51.693 |
| 1153.0 | 51.426 |
| 1152.0 | 52.594 |
| 1151.0 | 55.166 |
| 1150.0 | 58.324 |
| 1149.0 | 61.685 |
| 1148.0 | 64.225 |
| 1147.0 | 65.206 |
| 1146.0 | 64.522 |
| 1145.0 | 62.737 |
| 1144.0 | 60.816 |
| 1143.0 | 59.397 |
| 1142.0 | 58.982 |
| 1141.0 | 59.645 |
| 1140.0 | 61.154 |
| 1139.0 | 62.865 |
| 1138.0 | 64.065 |
| 1137.0 | 64.021 |
| 1136.0 | 62.513 |
| 1135.0 | 59.626 |
| 1134.0 | 56.442 |
| 1133.0 | 53.466 |
| 1132.0 | 51.274 |
| 1131.0 | 50.111 |
| 1130.0 | 50.09 |
| 1129.0 | 50.953 |
| 1128.0 | 52.269 |
| 1127.0 | 53.581 |
| 1126.0 | 54.225 |
| 1125.0 | 53.933 |
| 1124.0 | 52.704 |
| 1123.0 | 50.86 |
| 1122.0 | 49.095 |
| 1121.0 | 48.029 |
| 1120.0 | 47.905 |
| 1119.0 | 48.815 |
| 1118.0 | 50.635 |
| 1117.0 | 53.103 |
| 1116.0 | 55.539 |
| 1115.0 | 57.609 |
| 1114.0 | 58.664 |
| 1113.0 | 58.84 |
| 1112.0 | 58.51 |
| 1111.0 | 58.247 |
| 1110.0 | 58.519 |
| 1109.0 | 59.511 |
| 1108.0 | 60.977 |
| 1107.0 | 62.461 |
| 1106.0 | 63.324 |
| 1105.0 | 63.178 |
| 1104.0 | 62.095 |
| 1103.0 | 60.382 |
| 1102.0 | 58.716 |
| 1101.0 | 57.809 |
| 1100.0 | 57.778 |
| 1099.0 | 58.632 |
| 1098.0 | 59.865 |
| 1097.0 | 60.783 |
| 1096.0 | 60.485 |
| 1095.0 | 58.531 |
| 1094.0 | 55.368 |
| 1093.0 | 51.535 |
| 1092.0 | 48.372 |
| 1091.0 | 46.073 |
| 1090.0 | 45.07 |
| 1089.0 | 45.353 |
| 1088.0 | 46.62 |
| 1087.0 | 48.304 |
| 1086.0 | 49.341 |
| 1085.0 | 48.761 |
| 1084.0 | 46.491 |
| 1083.0 | 42.865 |
| 1082.0 | 39.346 |
| 1081.0 | 36.57 |
| 1080.0 | 35.128 |
| 1079.0 | 35.194 |
| 1078.0 | 36.813 |
| 1077.0 | 39.522 |
| 1076.0 | 42.658 |
| 1075.0 | 45.248 |
| 1074.0 | 45.985 |
| 1073.0 | 44.67 |
| 1072.0 | 41.973 |
| 1071.0 | 39.47 |
| 1070.0 | 38 |
| 1069.0 | 38.097 |
| 1068.0 | 39.988 |
| 1067.0 | 43.738 |
| 1066.0 | 48.741 |
| 1065.0 | 53.749 |
| 1064.0 | 57.03 |
| 1063.0 | 57.722 |
| 1062.0 | 55.918 |
| 1061.0 | 53.313 |
| 1060.0 | 51.221 |
| 1059.0 | 50.668 |
| 1058.0 | 52.012 |
| 1057.0 | 55.097 |
| 1056.0 | 58.881 |
| 1055.0 | 62.421 |
| 1054.0 | 64.111 |
| 1053.0 | 63.552 |
| 1052.0 | 61.366 |
| 1051.0 | 58.749 |
| 1050.0 | 56.618 |
| 1049.0 | 55.495 |
| 1048.0 | 55.282 |
| 1047.0 | 55.129 |
| 1046.0 | 53.939 |
| 1045.0 | 51.198 |
| 1044.0 | 47.068 |
| 1043.0 | 42.23 |
| 1042.0 | 37.99 |
| 1041.0 | 34.514 |
| 1040.0 | 32.254 |
| 1039.0 | 30.999 |
| 1038.0 | 30.368 |
| 1037.0 | 29.937 |
| 1036.0 | 29.506 |
| 1035.0 | 28.772 |
| 1034.0 | 27.823 |
| 1033.0 | 26.824 |
| 1032.0 | 25.985 |
| 1031.0 | 25.596 |
| 1030.0 | 25.615 |
| 1029.0 | 25.912 |
| 1028.0 | 26.237 |
| 1027.0 | 26.391 |
| 1026.0 | 26.242 |
| 1025.0 | 25.859 |
| 1024.0 | 25.422 |
| 1023.0 | 25.131 |
| 1022.0 | 25.166 |
| 1021.0 | 25.623 |
| 1020.0 | 26.421 |
| 1019.0 | 27.365 |
| 1018.0 | 28.261 |
| 1017.0 | 28.991 |
| 1016.0 | 29.373 |
| 1015.0 | 29.661 |
| 1014.0 | 30.1 |
| 1013.0 | 30.968 |
| 1012.0 | 32.458 |
| 1011.0 | 34.686 |
| 1010.0 | 37.497 |
| 1009.0 | 40.59 |
| 1008.0 | 43.668 |
| 1007.0 | 46.404 |
| 1006.0 | 48.72 |
| 1005.0 | 50.845 |
| 1004.0 | 53.436 |
| 1003.0 | 57.045 |
| 1002.0 | 61.537 |
| 1001.0 | 66.983 |
| 1000.0 | 71.922 |
| 999.0 | 75.999 |
| 998.0 | 78.633 |
| 997.0 | 80.015 |
| 996.0 | 80.557 |
| 995.0 | 80.858 |
| 994.0 | 80.864 |
| 993.0 | 80.112 |
| 992.0 | 78.341 |
| 991.0 | 75.571 |
| 990.0 | 72.444 |
| 989.0 | 69.539 |
| 988.0 | 67.645 |
| 987.0 | 67.121 |
| 986.0 | 67.676 |
| 985.0 | 68.95 |
| 984.0 | 70.161 |
| 983.0 | 70.91 |
| 982.0 | 70.957 |
| 981.0 | 70.48 |
| 980.0 | 69.922 |
| 979.0 | 69.606 |
| 978.0 | 69.679 |
| 977.0 | 70.085 |
| 976.0 | 70.643 |
| 975.0 | 71.249 |
| 974.0 | 71.751 |
| 973.0 | 72.334 |
| 972.0 | 73.111 |
| 971.0 | 74.177 |
| 970.0 | 75.532 |
| 969.0 | 77.083 |
| 968.0 | 78.454 |
| 967.0 | 79.477 |
| 966.0 | 80 |
| 965.0 | 80.178 |
| 964.0 | 80.065 |
| 963.0 | 79.761 |
| 962.0 | 79.331 |
| 961.0 | 78.713 |
| 960.0 | 78.009 |
| 959.0 | 77.341 |
| 958.0 | 76.82 |
| 957.0 | 76.518 |
| 956.0 | 76.394 |
| 955.0 | 76.193 |
| 954.0 | 75.84 |
| 953.0 | 75.274 |
| 952.0 | 74.638 |
| 951.0 | 74.182 |
| 950.0 | 74.129 |
| 949.0 | 74.471 |
| 948.0 | 75.029 |
| 947.0 | 75.492 |
| 946.0 | 75.643 |
| 945.0 | 75.501 |
| 944.0 | 75.325 |
| 943.0 | 75.442 |
| 942.0 | 76.044 |
| 941.0 | 77.167 |
| 940.0 | 78.548 |
| 939.0 | 79.815 |
| 938.0 | 80.954 |
| 937.0 | 81.967 |
| 936.0 | 82.875 |
| 935.0 | 83.974 |
| 934.0 | 85.087 |
| 933.0 | 86.162 |
| 932.0 | 86.982 |
| 931.0 | 87.299 |
| 930.0 | 87.252 |
| 929.0 | 87.003 |
| 928.0 | 86.84 |
| 927.0 | 86.879 |
| 926.0 | 86.94 |
| 925.0 | 86.803 |
| 924.0 | 86.278 |
| 923.0 | 85.447 |
| 922.0 | 84.638 |
| 921.0 | 84.121 |
| 920.0 | 84.043 |
| 919.0 | 84.191 |
| 918.0 | 84.251 |
| 917.0 | 83.935 |
| 916.0 | 83.305 |
| 915.0 | 82.641 |
| 914.0 | 82.282 |
| 913.0 | 82.5 |
| 912.0 | 83.258 |
| 911.0 | 84.331 |
| 910.0 | 85.488 |
| 909.0 | 86.537 |
| 908.0 | 87.455 |
| 907.0 | 88.377 |
| 906.0 | 89.309 |
| 905.0 | 90.055 |
| 904.0 | 90.525 |
| 903.0 | 90.713 |
| 902.0 | 90.728 |
| 901.0 | 90.639 |
| 900.0 | 90.536 |
| 899.0 | 90.47 |
| 898.0 | 90.4 |
| 897.0 | 90.362 |
| 896.0 | 90.403 |
| 895.0 | 90.573 |
| 894.0 | 90.922 |
| 893.0 | 91.417 |
| 892.0 | 91.941 |
| 891.0 | 92.322 |
| 890.0 | 92.536 |
| 889.0 | 92.613 |
| 888.0 | 92.644 |
| 887.0 | 92.688 |
| 886.0 | 92.812 |
| 885.0 | 93.008 |
| 884.0 | 93.187 |
| 883.0 | 93.335 |
| 882.0 | 93.462 |
| 881.0 | 93.611 |
| 880.0 | 93.797 |
| 879.0 | 94.032 |
| 878.0 | 94.243 |
| 877.0 | 94.452 |
| 876.0 | 94.704 |
| 875.0 | 94.924 |
| 874.0 | 95.115 |
| 873.0 | 95.311 |
| 872.0 | 95.476 |
| 871.0 | 95.639 |
| 870.0 | 95.801 |
| 869.0 | 95.925 |
| 868.0 | 96.029 |
| 867.0 | 96.115 |
| 866.0 | 96.205 |
| 865.0 | 96.27 |
| 864.0 | 96.319 |
| 863.0 | 96.378 |
| 862.0 | 96.424 |
| 861.0 | 96.462 |
| 860.0 | 96.895 |
| 859.0 | 97.237 |
| 858.0 | 96.859 |
| 857.0 | 96.133 |
| 856.0 | 95.776 |
| 855.0 | 96.184 |
| 854.0 | 96.997 |
| 853.0 | 97.46 |
| 852.0 | 97.343 |
| 851.0 | 96.855 |
| 850.0 | 96.427 |
| 849.0 | 96.681 |
| 848.0 | 97.405 |
| 847.0 | 97.913 |
| 846.0 | 97.776 |
| 845.0 | 97.167 |
| 844.0 | 96.786 |
| 843.0 | 97.053 |
| 842.0 | 97.757 |
| 841.0 | 98.251 |
| 840.0 | 98.096 |
| 839.0 | 97.595 |
| 838.0 | 97.168 |
| 837.0 | 97.207 |
| 836.0 | 97.546 |
| 835.0 | 97.587 |
| 834.0 | 97.268 |
| 833.0 | 96.991 |
| 832.0 | 97.104 |
| 831.0 | 97.683 |
| 830.0 | 98.167 |
| 829.0 | 98.003 |
| 828.0 | 97.292 |
| 827.0 | 96.595 |
| 826.0 | 96.589 |
| 825.0 | 97.398 |
| 824.0 | 98.238 |
| 823.0 | 98.451 |
| 822.0 | 98.023 |
| 821.0 | 97.434 |
| 820.0 | 97.277 |
| 819.0 | 97.819 |
| 818.0 | 98.602 |
| 817.0 | 99.075 |
| 816.0 | 99.129 |
| 815.0 | 99.068 |
| 814.0 | 99.024 |
| 813.0 | 99.109 |
| 812.0 | 99.181 |
| 811.0 | 99.067 |
| 810.0 | 98.09 |
| 809.0 | 97.668 |
| 808.0 | 99.221 |
| 807.0 | 98.804 |
| 806.0 | 98.406 |
| 805.0 | 99.923 |
| 804.0 | 99.965 |
| 803.0 | 98.476 |
| 802.0 | 98.032 |
| 801.0 | 99.298 |
| 800.0 | 98.405 |
| 799.0 | 98.617 |
| 798.0 | 98.066 |
| 797.0 | 98.407 |
| 796.0 | 99.605 |
| 795.0 | 98.336 |
| 794.0 | 98.944 |
| 793.0 | 98.425 |
| 792.0 | 99.34 |
| 791.0 | 98.206 |
| 790.0 | 98.331 |
| 789.0 | 98.112 |
| 788.0 | 98.489 |
| 787.0 | 99.862 |
| 786.0 | 98.112 |
| 785.0 | 97.827 |
| 784.0 | 98.895 |
| 783.0 | 99.136 |
| 782.0 | 99.937 |
| 781.0 | 99.917 |
| 780.0 | 98.949 |
| 779.0 | 98.847 |
| 778.0 | 99.671 |
| 777.0 | 99.095 |
| 776.0 | 99.901 |
| 775.0 | 99.061 |
| 774.0 | 97.518 |
| 773.0 | 99.417 |
| 772.0 | 99.323 |
| 771.0 | 99.126 |
| 770.0 | 99.922 |
| 769.0 | 98.787 |
| 768.0 | 96.899 |
| 767.0 | 98.4 |
| 766.0 | 98.595 |
| 765.0 | 99.639 |
| 764.0 | 99.999 |
| 763.0 | 98.624 |
| 762.0 | 97.562 |
| 761.0 | 97.747 |
| 760.0 | 97.982 |
| 759.0 | 98.598 |
| 758.0 | 99.379 |
| 757.0 | 99.81 |
| 756.0 | 98.651 |
| 755.0 | 99.414 |
| 754.0 | 99.034 |
| 753.0 | 98.651 |
| 752.0 | 98.778 |
| 751.0 | 98.707 |
| 750.0 | 99.031 |
| 749.0 | 98.921 |
| 748.0 | 99.697 |
| 747.0 | 98.623 |
| 746.0 | 99.245 |
| 745.0 | 99.298 |
| 744.0 | 98.384 |
| 743.0 | 98.599 |
| 742.0 | 98.807 |
| 741.0 | 97.65 |
| 740.0 | 98.334 |
| 739.0 | 98.136 |
| 738.0 | 98.484 |
| 737.0 | 99.712 |
| 736.0 | 98.387 |
| 735.0 | 98.168 |
| 734.0 | 99.044 |
| 733.0 | 98.771 |
| 732.0 | 98.377 |
| 731.0 | 99.243 |
| 730.0 | 98.946 |
| 729.0 | 98.798 |
| 728.0 | 99.505 |
| 727.0 | 99.5 |
| 726.0 | 99.473 |
| 725.0 | 99.621 |
| 724.0 | 98.275 |
| 723.0 | 98.538 |
| 722.0 | 99.295 |
| 721.0 | 99.124 |
| 720.0 | 98.817 |
| 719.0 | 99.191 |
| 718.0 | 98.989 |
| 717.0 | 99.002 |
| 716.0 | 99.249 |
| 715.0 | 97.951 |
| 714.0 | 98.594 |
| 713.0 | 99.663 |
| 712.0 | 99.544 |
| 711.0 | 99.386 |
| 710.0 | 99.555 |
| 709.0 | 98.594 |
| 708.0 | 99.382 |
| 707.0 | 99.087 |
| 706.0 | 98.396 |
| 705.0 | 98.73 |
| 704.0 | 99.568 |
| 703.0 | 98.771 |
| 702.0 | 98.353 |
| 701.0 | 98.755 |
| 700.0 | 98.542 |
| 699.0 | 98.651 |
| 698.0 | 98.448 |
| 697.0 | 98.728 |
| 696.0 | 99.133 |
| 695.0 | 99.572 |
| 694.0 | 99.345 |
| 693.0 | 99.032 |
| 692.0 | 99.783 |
| 691.0 | 99.389 |
| 690.0 | 99.5 |
| 689.0 | 99.1 |
| 688.0 | 99.163 |
| 687.0 | 99.498 |
| 686.0 | 98.936 |
| 685.0 | 98.679 |
| 684.0 | 98.479 |
| 683.0 | 98.916 |
| 682.0 | 98.933 |
| 681.0 | 99.106 |
| 680.0 | 98.692 |
| 679.0 | 99.301 |
| 678.0 | 99.541 |
| 677.0 | 99.078 |
| 676.0 | 98.841 |
| 675.0 | 99.54 |
| 674.0 | 99.259 |
| 673.0 | 98.884 |
| 672.0 | 98.926 |
| 671.0 | 99.141 |
| 670.0 | 99.002 |
| 669.0 | 99.182 |
| 668.0 | 98.986 |
| 667.0 | 98.93 |
| 666.0 | 98.962 |
| 665.0 | 99.261 |
| 664.0 | 99.353 |
| 663.0 | 99.124 |
| 662.0 | 98.496 |
| 661.0 | 98.742 |
| 660.0 | 99.043 |
| 659.0 | 99.163 |
| 658.0 | 98.806 |
| 657.0 | 98.928 |
| 656.0 | 98.816 |
| 655.0 | 98.568 |
| 654.0 | 98.579 |
| 653.0 | 99.12 |
| 652.0 | 99.5 |
| 651.0 | 99.619 |
| 650.0 | 98.845 |
| 649.0 | 98.885 |
| 648.0 | 99.209 |
| 647.0 | 99.076 |
| 646.0 | 98.804 |
| 645.0 | 98.914 |
| 644.0 | 99.057 |
| 643.0 | 99.094 |
| 642.0 | 98.857 |
| 641.0 | 98.889 |
| 640.0 | 98.848 |
| 639.0 | 99.015 |
| 638.0 | 98.634 |
| 637.0 | 98.258 |
| 636.0 | 98.771 |
| 635.0 | 98.847 |
| 634.0 | 98.342 |
| 633.0 | 98.457 |
| 632.0 | 98.798 |
| 631.0 | 98.301 |
| 630.0 | 97.916 |
| 629.0 | 98.169 |
| 628.0 | 98.631 |
| 627.0 | 98.193 |
| 626.0 | 97.507 |
| 625.0 | 98.252 |
| 624.0 | 98.814 |
| 623.0 | 98.442 |
| 622.0 | 98.466 |
| 621.0 | 98.26 |
| 620.0 | 97.833 |
| 619.0 | 97.462 |
| 618.0 | 97.28 |
| 617.0 | 97.906 |
| 616.0 | 97.729 |
| 615.0 | 97.574 |
| 614.0 | 97.676 |
| 613.0 | 97.027 |
| 612.0 | 97.608 |
| 611.0 | 97.927 |
| 610.0 | 97.019 |
| 609.0 | 97.259 |
| 608.0 | 97.866 |
| 607.0 | 97.385 |
| 606.0 | 96.873 |
| 605.0 | 94.894 |
| 604.0 | 93.445 |
| 603.0 | 51.804 |
| 602.0 | 33.374 |
| 601.0 | 13.816 |
| 600.0 | 0.011 |
| 599.0 | 0.001 |
| 598.0 | 0 |
| 597.0 | 0 |
| 596.0 | 0 |
| 595.0 | 0 |
| 594.0 | 0 |
| 593.0 | 0 |
| 592.0 | 0 |
| 591.0 | 0 |
| 590.0 | 0 |
| 589.0 | 0 |
| 588.0 | 0 |
| 587.0 | 0.003 |
| 586.0 | 0.043 |
| 585.0 | 1.255 |
| 584.0 | 25.154 |
| 583.0 | 69.963 |
| 582.0 | 93.288 |
| 581.0 | 96.237 |
| 580.0 | 96.711 |
| 579.0 | 96.066 |
| 578.0 | 97.261 |
| 577.0 | 97.635 |
| 576.0 | 97.702 |
| 575.0 | 96.916 |
| 574.0 | 96.921 |
| 573.0 | 97.424 |
| 572.0 | 98.061 |
| 571.0 | 98.013 |
| 570.0 | 97.93 |
| 569.0 | 96.894 |
| 568.0 | 96.69 |
| 567.0 | 97.951 |
| 566.0 | 97.095 |
| 565.0 | 97.457 |
| 564.0 | 98.118 |
| 563.0 | 97.47 |
| 562.0 | 96.947 |
| 561.0 | 97.855 |
| 560.0 | 97.835 |
| 559.0 | 96.833 |
| 558.0 | 97.393 |
| 557.0 | 97.674 |
| 556.0 | 96.716 |
| 555.0 | 96.616 |
| 554.0 | 97.348 |
| 553.0 | 97.703 |
| 552.0 | 97.552 |
| 551.0 | 97.653 |
| 550.0 | 98.231 |
| 549.0 | 98.133 |
| 548.0 | 97.908 |
| 547.0 | 97.28 |
| 546.0 | 97.199 |
| 545.0 | 97.298 |
| 544.0 | 97.28 |
| 543.0 | 98.127 |
| 542.0 | 97.75 |
| 541.0 | 97.949 |
| 540.0 | 97.652 |
| 539.0 | 97.98 |
| 538.0 | 96.736 |
| 537.0 | 97.507 |
| 536.0 | 96.441 |
| 535.0 | 96.438 |
| 534.0 | 96.417 |
| 533.0 | 97.276 |
| 532.0 | 97.766 |
| 531.0 | 97.991 |
| 530.0 | 97.018 |
| 529.0 | 97.713 |
| 528.0 | 97.476 |
| 527.0 | 97.101 |
| 526.0 | 96.987 |
| 525.0 | 97.469 |
| 524.0 | 96.793 |
| 523.0 | 97.552 |
| 522.0 | 97.441 |
| 521.0 | 97.268 |
| 520.0 | 97.473 |
| 519.0 | 97.466 |
| 518.0 | 96.916 |
| 517.0 | 97.405 |
| 516.0 | 96.961 |
| 515.0 | 97.243 |
| 514.0 | 97.565 |
| 513.0 | 97.152 |
| 512.0 | 97.105 |
| 511.0 | 96.965 |
| 510.0 | 97.53 |
| 509.0 | 97.057 |
| 508.0 | 96.824 |
| 507.0 | 97.779 |
| 506.0 | 97.384 |
| 505.0 | 97.971 |
| 504.0 | 98.012 |
| 503.0 | 97.714 |
| 502.0 | 97.12 |
| 501.0 | 97.816 |
| 500.0 | 97.355 |
| 499.0 | 97.25 |
| 498.0 | 97.218 |
| 497.0 | 96.848 |
| 496.0 | 97.152 |
| 495.0 | 96.875 |
| 494.0 | 96.303 |
| 493.0 | 97.452 |
| 492.0 | 96.645 |
| 491.0 | 96.908 |
| 490.0 | 97.197 |
| 489.0 | 97.778 |
| 488.0 | 96.434 |
| 487.0 | 96.7 |
| 486.0 | 96.46 |
| 485.0 | 96.917 |
| 484.0 | 96.751 |
| 483.0 | 97.399 |
| 482.0 | 96.785 |
| 481.0 | 96.575 |
| 480.0 | 96.585 |
| 479.0 | 96.813 |
| 478.0 | 97.568 |
| 477.0 | 96.664 |
| 476.0 | 96.298 |
| 475.0 | 96.967 |
| 474.0 | 96.452 |
| 473.0 | 96.795 |
| 472.0 | 96.98 |
| 471.0 | 95.921 |
| 470.0 | 96.005 |
| 469.0 | 96.999 |
| 468.0 | 97.262 |
| 467.0 | 96.928 |
| 466.0 | 96.719 |
| 465.0 | 96.355 |
| 464.0 | 95.175 |
| 463.0 | 96.151 |
| 462.0 | 95.748 |
| 461.0 | 96.589 |
| 460.0 | 96.479 |
| 459.0 | 96.067 |
| 458.0 | 95.668 |
| 457.0 | 95.752 |
| 456.0 | 96.582 |
| 455.0 | 96.407 |
| 454.0 | 95.431 |
| 453.0 | 95.813 |
| 452.0 | 95.724 |
| 451.0 | 95.991 |
| 450.0 | 95.624 |
| 449.0 | 95.909 |
| 448.0 | 95.695 |
| 447.0 | 96.254 |
| 446.0 | 95.603 |
| 445.0 | 95.617 |
| 444.0 | 95.456 |
| 443.0 | 95.311 |
| 442.0 | 94.948 |
| 441.0 | 93.848 |
| 440.0 | 94.277 |
| 439.0 | 95.571 |
| 438.0 | 95.419 |
| 437.0 | 95.286 |
| 436.0 | 95.197 |
| 435.0 | 94.861 |
| 434.0 | 94.618 |
| 433.0 | 94.535 |
| 432.0 | 94.27 |
| 431.0 | 93.954 |
| 430.0 | 93.782 |
| 429.0 | 93.634 |
| 428.0 | 93.395 |
| 427.0 | 92.893 |
| 426.0 | 92.415 |
| 425.0 | 92.208 |
| 424.0 | 91.859 |
| 423.0 | 91.279 |
| 422.0 | 90.954 |
| 421.0 | 90.671 |
| 420.0 | 89.962 |
| 419.0 | 88.776 |
| 418.0 | 87.042 |
| 417.0 | 84.296 |
| 416.0 | 72.464 |
| 415.0 | 45.932 |
| 414.0 | 17.934 |
| 413.0 | 3.455 |
| 412.0 | 0.22 |
| 411.0 | 0.028 |
| 410.0 | 0.009 |
| 409.0 | 0.002 |
| 408.0 | 0.003 |
| 407.0 | 0.001 |
| 406.0 | 0.001 |
| 405.0 | 0.004 |
| 404.0 | 0.002 |
| 403.0 | 0.003 |
| 402.0 | 0.004 |
| 401.0 | 0.002 |
| 400.0 | 0 |
| 399.0 | 0.004 |
| 398.0 | 0.005 |
| 397.0 | 0.005 |
| 396.0 | 0.005 |
| 395.0 | 0.006 |
| 394.0 | 0.002 |
| 393.0 | 0.004 |
| 392.0 | 0.002 |
| 391.0 | 0.003 |
| 390.0 | 0.005 |
| 389.0 | 0.002 |
| 388.0 | 0.002 |
| 387.0 | 0.004 |
| 386.0 | 0.002 |
| 385.0 | 0.001 |
| 384.0 | 0.004 |
| 383.0 | 0.002 |
| 382.0 | 0.001 |
| 381.0 | 0.004 |
| 380.0 | 0.001 |
| 379.0 | 0.002 |
| 378.0 | 0.004 |
| 377.0 | 0.005 |
| 376.0 | 0.004 |
| 375.0 | 0.002 |
| 374.0 | 0.003 |
| 373.0 | 0.001 |
| 372.0 | 0 |
| 371.0 | 0.004 |
| 370.0 | 0.004 |
| 369.0 | 0.004 |
| 368.0 | 0.004 |
| 367.0 | 0.002 |
| 366.0 | 0 |
| 365.0 | 0.004 |
| 364.0 | 0.005 |
| 363.0 | 0.006 |
| 362.0 | 0.004 |
| 361.0 | 0.002 |
| 360.0 | 0.001 |
| 359.0 | 0.005 |
| 358.0 | 0.006 |
| 357.0 | 0.003 |
| 356.0 | 0.004 |
| 355.0 | 0.002 |
| 354.0 | 0.002 |
| 353.0 | 0.006 |
| 352.0 | 0.005 |
| 351.0 | 0.004 |
| 350.0 | 0.005 |
| 349.0 | 0.002 |
| 348.0 | 0.001 |
| 347.0 | 0.003 |
| 346.0 | 0.006 |
| 345.0 | 0.002 |
| 344.0 | 0.005 |
| 343.0 | 0.003 |
| 342.0 | 0.002 |
| 341.0 | 0.004 |
| 340.0 | 0.006 |
| 339.0 | 0.001 |
| 338.0 | 0.006 |
| 337.0 | 0.001 |
| 336.0 | 0.002 |
| 335.0 | 0.005 |
| 334.0 | 0.007 |
| 333.0 | 0.005 |
| 332.0 | 0.007 |
| 331.0 | 0.002 |
| 330.0 | 0.002 |
| 329.0 | 0.003 |
| 328.0 | 0.005 |
| 327.0 | 0.004 |
| 326.0 | 0.006 |
| 325.0 | 0.001 |
| 324.0 | 0.002 |
| 323.0 | 0.005 |
| 322.0 | 0.007 |
| 321.0 | 0.005 |
| 320.0 | 0.007 |
| 319.0 | 0.001 |
| 318.0 | 0.004 |
| 317.0 | 0.006 |
| 316.0 | 0.005 |
| 315.0 | 0.003 |
| 314.0 | 0.004 |
| 313.0 | 0.001 |
| 312.0 | 0 |
| 311.0 | 0.004 |
| 310.0 | 0.004 |
| 309.0 | 0.003 |
| 308.0 | 0.004 |
| 307.0 | 0.002 |
| 306.0 | 0.001 |
| 305.0 | 0.006 |
| 304.0 | 0.005 |
| 303.0 | 0.005 |
| 302.0 | 0.004 |
| 301.0 | 0.001 |
| 300.0 | 0.001 |
| 299.0 | 0.004 |
| 298.0 | 0.006 |
| 297.0 | 0.002 |
| 296.0 | 0.005 |
| 295.0 | 0.001 |
| 294.0 | 0.002 |
| 293.0 | 0.004 |
| 292.0 | 0.006 |
| 291.0 | 0.001 |
| 290.0 | 0.004 |
| 289.0 | 0.001 |
| 288.0 | 0.002 |
| 287.0 | 0.004 |
| 286.0 | 0.008 |
| 285.0 | 0.001 |
| 284.0 | 0.005 |
| 283.0 | 0 |
| 282.0 | 0.001 |
| 281.0 | 0.005 |
| 280.0 | 0.007 |
| 279.0 | 0.004 |
| 278.0 | 0.008 |
| 277.0 | 0.001 |
| 276.0 | 0.003 |
| 275.0 | 0.005 |
| 274.0 | 0.007 |
| 273.0 | 0.001 |
| 272.0 | 0.006 |
| 271.0 | 0.001 |
| 270.0 | 0.002 |
| 269.0 | 0.005 |
| 268.0 | 0.007 |
| 267.0 | 0.002 |
| 266.0 | 0.003 |
| 265.0 | 0.002 |
| 264.0 | 0.003 |
| 263.0 | 0.007 |
| 262.0 | 0.007 |
| 261.0 | 0.004 |
| 260.0 | 0.006 |
| 259.0 | 0 |
| 258.0 | 0.003 |
| 257.0 | 0.006 |
| 256.0 | 0.006 |
| 255.0 | 0.003 |
| 254.0 | 0.006 |
| 253.0 | 0.002 |
| 252.0 | 0.002 |
| 251.0 | 0.008 |
| 250.0 | 0.005 |
| 249.0 | 0.005 |
| 248.0 | 0.005 |
| 247.0 | 0.001 |
| 246.0 | 0.001 |
| 245.0 | 0.008 |
| 244.0 | 0 |
| 243.0 | 0.007 |
| 242.0 | 0.003 |
| 241.0 | 0.005 |
| 240.0 | 0.006 |
| 239.0 | 0.007 |
| 238.0 | 0.006 |
| 237.0 | 0.008 |
| 236.0 | 0.001 |
| 235.0 | 0.003 |
| 234.0 | 0.006 |
| 233.0 | 0.009 |
| 232.0 | 0.007 |
| 231.0 | 0.004 |
| 230.0 | 0.005 |
| 229.0 | 0.006 |
| 228.0 | 0.004 |
| 227.0 | 0.006 |
| 226.0 | 0.002 |
| 225.0 | 0.007 |
| 224.0 | 0.006 |
| 223.0 | 0.004 |
| 222.0 | 0.002 |
| 221.0 | 0.01 |
| 220.0 | 0.005 |
| 219.0 | 0.006 |
| 218.0 | 0.004 |
| 217.0 | 0.002 |
| 216.0 | 0.003 |
| 215.0 | 0.007 |
| 214.0 | 0.006 |
| 213.0 | 0.004 |
| 212.0 | 0.007 |
| 211.0 | 0.003 |
| 210.0 | 0.004 |
| 209.0 | 0.007 |
| 208.0 | 0.006 |
| 207.0 | 0.005 |
| 206.0 | 0.007 |
| 205.0 | 0.004 |
| 204.0 | 0.006 |
| 203.0 | 0.009 |
| 202.0 | 0.009 |
| 201.0 | 0.008 |
| 200.0 | 0.01 |